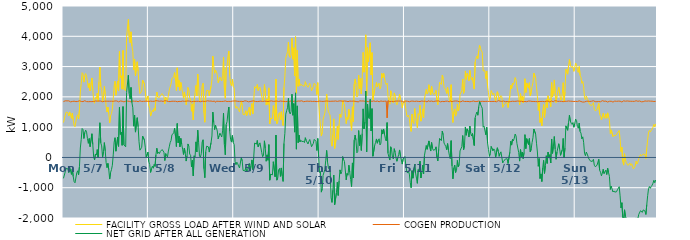
| Category | FACILITY GROSS LOAD AFTER WIND AND SOLAR | COGEN PRODUCTION | NET GRID AFTER ALL GENERATION |
|---|---|---|---|
|  Mon  5/7 | 1152 | 1843 | -691 |
|  Mon  5/7 | 1163 | 1846 | -683 |
|  Mon  5/7 | 1392 | 1869 | -477 |
|  Mon  5/7 | 1498 | 1859 | -361 |
|  Mon  5/7 | 1514 | 1867 | -353 |
|  Mon  5/7 | 1474 | 1850 | -376 |
|  Mon  5/7 | 1367 | 1868 | -501 |
|  Mon  5/7 | 1501 | 1839 | -338 |
|  Mon  5/7 | 1387 | 1835 | -448 |
|  Mon  5/7 | 1292 | 1853 | -561 |
|  Mon  5/7 | 1465 | 1848 | -383 |
|  Mon  5/7 | 1230 | 1861 | -631 |
|  Mon  5/7 | 1054 | 1856 | -802 |
|  Mon  5/7 | 1012 | 1849 | -837 |
|  Mon  5/7 | 999 | 1843 | -844 |
|  Mon  5/7 | 1354 | 1860 | -506 |
|  Mon  5/7 | 1407 | 1848 | -441 |
|  Mon  5/7 | 1271 | 1845 | -574 |
|  Mon  5/7 | 1564 | 1871 | -307 |
|  Mon  5/7 | 2160 | 1848 | 312 |
|  Mon  5/7 | 2443 | 1849 | 594 |
|  Mon  5/7 | 2799 | 1843 | 956 |
|  Mon  5/7 | 2764 | 1843 | 921 |
|  Mon  5/7 | 2487 | 1861 | 626 |
|  Mon  5/7 | 2698 | 1873 | 825 |
|  Mon  5/7 | 2769 | 1867 | 902 |
|  Mon  5/7 | 2679 | 1844 | 835 |
|  Mon  5/7 | 2483 | 1862 | 621 |
|  Mon  5/7 | 2306 | 1840 | 466 |
|  Mon  5/7 | 2446 | 1821 | 625 |
|  Mon  5/7 | 2199 | 1844 | 355 |
|  Mon  5/7 | 2175 | 1852 | 323 |
|  Mon  5/7 | 2624 | 1843 | 781 |
|  Mon  5/7 | 2242 | 1816 | 426 |
|  Mon  5/7 | 1863 | 1847 | 16 |
|  Mon  5/7 | 1789 | 1870 | -81 |
|  Mon  5/7 | 1977 | 1863 | 114 |
|  Mon  5/7 | 1939 | 1860 | 79 |
|  Mon  5/7 | 2119 | 1859 | 260 |
|  Mon  5/7 | 1848 | 1858 | -10 |
|  Mon  5/7 | 2497 | 1863 | 634 |
|  Mon  5/7 | 2985 | 1839 | 1146 |
|  Mon  5/7 | 2340 | 1861 | 479 |
|  Mon  5/7 | 2253 | 1872 | 381 |
|  Mon  5/7 | 1845 | 1839 | 6 |
|  Mon  5/7 | 2042 | 1849 | 193 |
|  Mon  5/7 | 2344 | 1855 | 489 |
|  Mon  5/7 | 2083 | 1866 | 217 |
|  Mon  5/7 | 1684 | 1857 | -173 |
|  Mon  5/7 | 1499 | 1837 | -338 |
|  Mon  5/7 | 1659 | 1856 | -197 |
|  Mon  5/7 | 1444 | 1849 | -405 |
|  Mon  5/7 | 1141 | 1855 | -714 |
|  Mon  5/7 | 1372 | 1870 | -498 |
|  Mon  5/7 | 1452 | 1856 | -404 |
|  Mon  5/7 | 1593 | 1850 | -257 |
|  Mon  5/7 | 1936 | 1851 | 85 |
|  Mon  5/7 | 2355 | 1853 | 502 |
|  Mon  5/7 | 2516 | 1865 | 651 |
|  Mon  5/7 | 2054 | 1848 | 206 |
|  Mon  5/7 | 2043 | 1864 | 179 |
|  Mon  5/7 | 2524 | 1858 | 666 |
|  Mon  5/7 | 2199 | 1835 | 364 |
|  Mon  5/7 | 3498 | 1845 | 1653 |
|  Mon  5/7 | 2624 | 1863 | 761 |
|  Mon  5/7 | 2697 | 1864 | 833 |
|  Mon  5/7 | 2255 | 1855 | 400 |
|  Mon  5/7 | 3532 | 1853 | 1679 |
|  Mon  5/7 | 2248 | 1835 | 413 |
|  Mon  5/7 | 2235 | 1841 | 394 |
|  Mon  5/7 | 2206 | 1856 | 350 |
|  Mon  5/7 | 3995 | 1849 | 2146 |
|  Mon  5/7 | 3989 | 1860 | 2129 |
|  Mon  5/7 | 4556 | 1844 | 2712 |
|  Mon  5/7 | 3958 | 1852 | 2106 |
|  Mon  5/7 | 3786 | 1855 | 1931 |
|  Mon  5/7 | 4147 | 1836 | 2311 |
|  Mon  5/7 | 3677 | 1868 | 1809 |
|  Mon  5/7 | 3503 | 1863 | 1640 |
|  Mon  5/7 | 2892 | 1860 | 1032 |
|  Mon  5/7 | 3250 | 1854 | 1396 |
|  Mon  5/7 | 2698 | 1862 | 836 |
|  Mon  5/7 | 2688 | 1857 | 831 |
|  Mon  5/7 | 3158 | 1847 | 1311 |
|  Mon  5/7 | 2853 | 1840 | 1013 |
|  Mon  5/7 | 2384 | 1863 | 521 |
|  Mon  5/7 | 2107 | 1868 | 239 |
|  Mon  5/7 | 2128 | 1868 | 260 |
|  Mon  5/7 | 2183 | 1849 | 334 |
|  Mon  5/7 | 2557 | 1851 | 706 |
|  Mon  5/7 | 2577 | 1853 | 724 |
|  Mon  5/7 | 2428 | 1850 | 578 |
|  Mon  5/7 | 2194 | 1855 | 339 |
|  Mon  5/7 | 1855 | 1850 | 5 |
|  Mon  5/7 | 1851 | 1858 | -7 |
|  Mon  5/7 | 2030 | 1859 | 171 |
|  Tue  5/8 | 1710 | 1850 | -140 |
|  Tue  5/8 | 1614 | 1850 | -236 |
|  Tue  5/8 | 1365 | 1860 | -495 |
|  Tue  5/8 | 1467 | 1839 | -372 |
|  Tue  5/8 | 1561 | 1851 | -290 |
|  Tue  5/8 | 1504 | 1863 | -359 |
|  Tue  5/8 | 1627 | 1853 | -226 |
|  Tue  5/8 | 1549 | 1848 | -299 |
|  Tue  5/8 | 1963 | 1874 | 89 |
|  Tue  5/8 | 2160 | 1856 | 304 |
|  Tue  5/8 | 1995 | 1866 | 129 |
|  Tue  5/8 | 2012 | 1834 | 178 |
|  Tue  5/8 | 1984 | 1855 | 129 |
|  Tue  5/8 | 2050 | 1850 | 200 |
|  Tue  5/8 | 2083 | 1863 | 220 |
|  Tue  5/8 | 2108 | 1848 | 260 |
|  Tue  5/8 | 2087 | 1849 | 238 |
|  Tue  5/8 | 2009 | 1837 | 172 |
|  Tue  5/8 | 1769 | 1872 | -103 |
|  Tue  5/8 | 1990 | 1862 | 128 |
|  Tue  5/8 | 2013 | 1865 | 148 |
|  Tue  5/8 | 1875 | 1860 | 15 |
|  Tue  5/8 | 2056 | 1846 | 210 |
|  Tue  5/8 | 2212 | 1862 | 350 |
|  Tue  5/8 | 2330 | 1843 | 487 |
|  Tue  5/8 | 2420 | 1865 | 555 |
|  Tue  5/8 | 2598 | 1855 | 743 |
|  Tue  5/8 | 2608 | 1857 | 751 |
|  Tue  5/8 | 2667 | 1854 | 813 |
|  Tue  5/8 | 2801 | 1835 | 966 |
|  Tue  5/8 | 2561 | 1854 | 707 |
|  Tue  5/8 | 2207 | 1849 | 358 |
|  Tue  5/8 | 2959 | 1838 | 1121 |
|  Tue  5/8 | 2324 | 1841 | 483 |
|  Tue  5/8 | 2549 | 1850 | 699 |
|  Tue  5/8 | 2212 | 1863 | 349 |
|  Tue  5/8 | 2475 | 1846 | 629 |
|  Tue  5/8 | 2312 | 1875 | 437 |
|  Tue  5/8 | 2135 | 1861 | 274 |
|  Tue  5/8 | 1956 | 1858 | 98 |
|  Tue  5/8 | 2162 | 1852 | 310 |
|  Tue  5/8 | 1988 | 1860 | 128 |
|  Tue  5/8 | 1737 | 1857 | -120 |
|  Tue  5/8 | 1916 | 1861 | 55 |
|  Tue  5/8 | 2310 | 1865 | 445 |
|  Tue  5/8 | 2217 | 1846 | 371 |
|  Tue  5/8 | 1968 | 1858 | 110 |
|  Tue  5/8 | 1926 | 1854 | 72 |
|  Tue  5/8 | 1526 | 1838 | -312 |
|  Tue  5/8 | 1766 | 1859 | -93 |
|  Tue  5/8 | 1237 | 1848 | -611 |
|  Tue  5/8 | 1893 | 1838 | 55 |
|  Tue  5/8 | 1865 | 1850 | 15 |
|  Tue  5/8 | 2374 | 1860 | 514 |
|  Tue  5/8 | 2032 | 1853 | 179 |
|  Tue  5/8 | 2754 | 1854 | 900 |
|  Tue  5/8 | 2356 | 1853 | 503 |
|  Tue  5/8 | 1891 | 1841 | 50 |
|  Tue  5/8 | 1845 | 1838 | 7 |
|  Tue  5/8 | 1972 | 1851 | 121 |
|  Tue  5/8 | 2367 | 1858 | 509 |
|  Tue  5/8 | 2448 | 1865 | 583 |
|  Tue  5/8 | 1476 | 1849 | -373 |
|  Tue  5/8 | 1162 | 1832 | -670 |
|  Tue  5/8 | 2036 | 1852 | 184 |
|  Tue  5/8 | 2213 | 1842 | 371 |
|  Tue  5/8 | 2229 | 1869 | 360 |
|  Tue  5/8 | 2205 | 1857 | 348 |
|  Tue  5/8 | 2037 | 1860 | 177 |
|  Tue  5/8 | 2055 | 1855 | 200 |
|  Tue  5/8 | 2350 | 1861 | 489 |
|  Tue  5/8 | 2571 | 1862 | 709 |
|  Tue  5/8 | 3346 | 1849 | 1497 |
|  Tue  5/8 | 3019 | 1866 | 1153 |
|  Tue  5/8 | 2781 | 1862 | 919 |
|  Tue  5/8 | 2884 | 1818 | 1066 |
|  Tue  5/8 | 2839 | 1857 | 982 |
|  Tue  5/8 | 2722 | 1849 | 873 |
|  Tue  5/8 | 2468 | 1852 | 616 |
|  Tue  5/8 | 2547 | 1835 | 712 |
|  Tue  5/8 | 2651 | 1850 | 801 |
|  Tue  5/8 | 2567 | 1827 | 740 |
|  Tue  5/8 | 2525 | 1848 | 677 |
|  Tue  5/8 | 2709 | 1833 | 876 |
|  Tue  5/8 | 3314 | 1851 | 1463 |
|  Tue  5/8 | 2268 | 1846 | 422 |
|  Tue  5/8 | 1953 | 1866 | 87 |
|  Tue  5/8 | 2953 | 1867 | 1086 |
|  Tue  5/8 | 3029 | 1845 | 1184 |
|  Tue  5/8 | 3322 | 1849 | 1473 |
|  Tue  5/8 | 3515 | 1850 | 1665 |
|  Tue  5/8 | 2701 | 1841 | 860 |
|  Tue  5/8 | 2433 | 1846 | 587 |
|  Tue  5/8 | 2366 | 1859 | 507 |
|  Tue  5/8 | 2585 | 1860 | 725 |
|  Tue  5/8 | 2343 | 1849 | 494 |
|  Wed  5/9 | 2287 | 1863 | 424 |
|  Wed  5/9 | 1722 | 1858 | -136 |
|  Wed  5/9 | 1621 | 1863 | -242 |
|  Wed  5/9 | 1682 | 1839 | -157 |
|  Wed  5/9 | 1644 | 1852 | -208 |
|  Wed  5/9 | 1573 | 1864 | -291 |
|  Wed  5/9 | 1503 | 1850 | -347 |
|  Wed  5/9 | 1497 | 1859 | -362 |
|  Wed  5/9 | 1849 | 1852 | -3 |
|  Wed  5/9 | 1725 | 1837 | -112 |
|  Wed  5/9 | 1415 | 1843 | -428 |
|  Wed  5/9 | 1433 | 1853 | -420 |
|  Wed  5/9 | 1423 | 1869 | -446 |
|  Wed  5/9 | 1540 | 1872 | -332 |
|  Wed  5/9 | 1381 | 1860 | -479 |
|  Wed  5/9 | 1409 | 1852 | -443 |
|  Wed  5/9 | 1558 | 1837 | -279 |
|  Wed  5/9 | 1658 | 1859 | -201 |
|  Wed  5/9 | 1394 | 1846 | -452 |
|  Wed  5/9 | 1611 | 1871 | -260 |
|  Wed  5/9 | 1779 | 1861 | -82 |
|  Wed  5/9 | 1439 | 1841 | -402 |
|  Wed  5/9 | 1891 | 1865 | 26 |
|  Wed  5/9 | 2338 | 1862 | 476 |
|  Wed  5/9 | 2347 | 1848 | 499 |
|  Wed  5/9 | 2288 | 1850 | 438 |
|  Wed  5/9 | 2405 | 1844 | 561 |
|  Wed  5/9 | 2207 | 1856 | 351 |
|  Wed  5/9 | 2275 | 1851 | 424 |
|  Wed  5/9 | 2318 | 1836 | 482 |
|  Wed  5/9 | 2331 | 1860 | 471 |
|  Wed  5/9 | 2025 | 1862 | 163 |
|  Wed  5/9 | 1868 | 1846 | 22 |
|  Wed  5/9 | 1942 | 1862 | 80 |
|  Wed  5/9 | 2406 | 1858 | 548 |
|  Wed  5/9 | 2150 | 1856 | 294 |
|  Wed  5/9 | 1728 | 1854 | -126 |
|  Wed  5/9 | 1928 | 1844 | 84 |
|  Wed  5/9 | 1752 | 1846 | -94 |
|  Wed  5/9 | 2296 | 1873 | 423 |
|  Wed  5/9 | 1107 | 1859 | -752 |
|  Wed  5/9 | 1300 | 1853 | -553 |
|  Wed  5/9 | 1314 | 1866 | -552 |
|  Wed  5/9 | 1283 | 1861 | -578 |
|  Wed  5/9 | 1709 | 1851 | -142 |
|  Wed  5/9 | 1689 | 1855 | -166 |
|  Wed  5/9 | 1217 | 1855 | -638 |
|  Wed  5/9 | 2585 | 1847 | 738 |
|  Wed  5/9 | 1113 | 1863 | -750 |
|  Wed  5/9 | 1172 | 1853 | -681 |
|  Wed  5/9 | 1437 | 1847 | -410 |
|  Wed  5/9 | 1481 | 1844 | -363 |
|  Wed  5/9 | 1235 | 1862 | -627 |
|  Wed  5/9 | 1508 | 1855 | -347 |
|  Wed  5/9 | 1240 | 1854 | -614 |
|  Wed  5/9 | 1053 | 1845 | -792 |
|  Wed  5/9 | 2312 | 1849 | 463 |
|  Wed  5/9 | 2664 | 1867 | 797 |
|  Wed  5/9 | 3272 | 1843 | 1429 |
|  Wed  5/9 | 3389 | 1847 | 1542 |
|  Wed  5/9 | 3490 | 1851 | 1639 |
|  Wed  5/9 | 3807 | 1858 | 1949 |
|  Wed  5/9 | 3353 | 1848 | 1505 |
|  Wed  5/9 | 3296 | 1860 | 1436 |
|  Wed  5/9 | 3380 | 1865 | 1515 |
|  Wed  5/9 | 3937 | 1850 | 2087 |
|  Wed  5/9 | 3243 | 1850 | 1393 |
|  Wed  5/9 | 3620 | 1842 | 1778 |
|  Wed  5/9 | 2694 | 1859 | 835 |
|  Wed  5/9 | 3989 | 1858 | 2131 |
|  Wed  5/9 | 2121 | 1848 | 273 |
|  Wed  5/9 | 3536 | 1834 | 1702 |
|  Wed  5/9 | 2349 | 1862 | 487 |
|  Wed  5/9 | 2587 | 1852 | 735 |
|  Wed  5/9 | 2369 | 1859 | 510 |
|  Wed  5/9 | 2412 | 1844 | 568 |
|  Wed  5/9 | 2394 | 1869 | 525 |
|  Wed  5/9 | 2372 | 1862 | 510 |
|  Wed  5/9 | 2372 | 1840 | 532 |
|  Wed  5/9 | 2348 | 1858 | 490 |
|  Wed  5/9 | 2500 | 1849 | 651 |
|  Wed  5/9 | 2405 | 1849 | 556 |
|  Wed  5/9 | 2438 | 1859 | 579 |
|  Wed  5/9 | 2317 | 1873 | 444 |
|  Wed  5/9 | 2386 | 1852 | 534 |
|  Wed  5/9 | 2448 | 1857 | 591 |
|  Wed  5/9 | 2339 | 1857 | 482 |
|  Wed  5/9 | 2200 | 1847 | 353 |
|  Wed  5/9 | 2227 | 1848 | 379 |
|  Wed  5/9 | 2333 | 1871 | 462 |
|  Wed  5/9 | 2450 | 1853 | 597 |
|  Wed  5/9 | 2474 | 1875 | 599 |
|  Wed  5/9 | 2375 | 1844 | 531 |
|  Wed  5/9 | 2077 | 1847 | 230 |
|  Wed  5/9 | 2469 | 1845 | 624 |
|  Wed  5/9 | 1855 | 1844 | 11 |
|  Thu  5/10 | 1364 | 1861 | -497 |
|  Thu  5/10 | 1392 | 1852 | -460 |
|  Thu  5/10 | 706 | 1852 | -1146 |
|  Thu  5/10 | 827 | 1860 | -1033 |
|  Thu  5/10 | 1258 | 1849 | -591 |
|  Thu  5/10 | 1289 | 1862 | -573 |
|  Thu  5/10 | 1465 | 1857 | -392 |
|  Thu  5/10 | 1766 | 1858 | -92 |
|  Thu  5/10 | 2094 | 1863 | 231 |
|  Thu  5/10 | 1705 | 1859 | -154 |
|  Thu  5/10 | 1510 | 1857 | -347 |
|  Thu  5/10 | 1454 | 1845 | -391 |
|  Thu  5/10 | 1376 | 1852 | -476 |
|  Thu  5/10 | 530 | 1862 | -1332 |
|  Thu  5/10 | 372 | 1857 | -1485 |
|  Thu  5/10 | 759 | 1840 | -1081 |
|  Thu  5/10 | 1273 | 1856 | -583 |
|  Thu  5/10 | 295 | 1855 | -1560 |
|  Thu  5/10 | 289 | 1864 | -1575 |
|  Thu  5/10 | 685 | 1855 | -1170 |
|  Thu  5/10 | 1030 | 1850 | -820 |
|  Thu  5/10 | 596 | 1851 | -1255 |
|  Thu  5/10 | 1086 | 1864 | -778 |
|  Thu  5/10 | 1434 | 1845 | -411 |
|  Thu  5/10 | 1323 | 1865 | -542 |
|  Thu  5/10 | 1391 | 1856 | -465 |
|  Thu  5/10 | 1882 | 1853 | 29 |
|  Thu  5/10 | 1788 | 1856 | -68 |
|  Thu  5/10 | 1730 | 1863 | -133 |
|  Thu  5/10 | 1697 | 1850 | -153 |
|  Thu  5/10 | 1117 | 1857 | -740 |
|  Thu  5/10 | 1321 | 1846 | -525 |
|  Thu  5/10 | 1254 | 1841 | -587 |
|  Thu  5/10 | 1588 | 1845 | -257 |
|  Thu  5/10 | 1368 | 1860 | -492 |
|  Thu  5/10 | 1139 | 1866 | -727 |
|  Thu  5/10 | 892 | 1856 | -964 |
|  Thu  5/10 | 1671 | 1852 | -181 |
|  Thu  5/10 | 1183 | 1860 | -677 |
|  Thu  5/10 | 2420 | 1848 | 572 |
|  Thu  5/10 | 2591 | 1853 | 738 |
|  Thu  5/10 | 2413 | 1851 | 562 |
|  Thu  5/10 | 1994 | 1842 | 152 |
|  Thu  5/10 | 2043 | 1844 | 199 |
|  Thu  5/10 | 2721 | 1834 | 887 |
|  Thu  5/10 | 2261 | 1869 | 392 |
|  Thu  5/10 | 2605 | 1862 | 743 |
|  Thu  5/10 | 2093 | 1862 | 231 |
|  Thu  5/10 | 2634 | 1843 | 791 |
|  Thu  5/10 | 3468 | 1864 | 1604 |
|  Thu  5/10 | 2814 | 1874 | 940 |
|  Thu  5/10 | 3024 | 1852 | 1172 |
|  Thu  5/10 | 4049 | 1859 | 2190 |
|  Thu  5/10 | 2034 | 1850 | 184 |
|  Thu  5/10 | 3627 | 1867 | 1760 |
|  Thu  5/10 | 3154 | 1843 | 1311 |
|  Thu  5/10 | 3134 | 1857 | 1277 |
|  Thu  5/10 | 3786 | 1868 | 1918 |
|  Thu  5/10 | 2720 | 1846 | 874 |
|  Thu  5/10 | 3462 | 1851 | 1611 |
|  Thu  5/10 | 1897 | 1858 | 39 |
|  Thu  5/10 | 1928 | 1866 | 62 |
|  Thu  5/10 | 2257 | 1860 | 397 |
|  Thu  5/10 | 2341 | 1847 | 494 |
|  Thu  5/10 | 2472 | 1861 | 611 |
|  Thu  5/10 | 2331 | 1862 | 469 |
|  Thu  5/10 | 2397 | 1831 | 566 |
|  Thu  5/10 | 2453 | 1837 | 616 |
|  Thu  5/10 | 2262 | 1850 | 412 |
|  Thu  5/10 | 2334 | 1864 | 470 |
|  Thu  5/10 | 2775 | 1861 | 914 |
|  Thu  5/10 | 2623 | 1851 | 772 |
|  Thu  5/10 | 2786 | 1847 | 939 |
|  Thu  5/10 | 2630 | 1855 | 775 |
|  Thu  5/10 | 2474 | 1849 | 625 |
|  Thu  5/10 | 2407 | 1860 | 547 |
|  Thu  5/10 | 2457 | 1307 | 1150 |
|  Thu  5/10 | 2008 | 1872 | 136 |
|  Thu  5/10 | 1873 | 1858 | 15 |
|  Thu  5/10 | 1759 | 1845 | -86 |
|  Thu  5/10 | 2201 | 1850 | 351 |
|  Thu  5/10 | 2115 | 1851 | 264 |
|  Thu  5/10 | 1855 | 1850 | 5 |
|  Thu  5/10 | 1797 | 1847 | -50 |
|  Thu  5/10 | 2130 | 1841 | 289 |
|  Thu  5/10 | 2026 | 1856 | 170 |
|  Thu  5/10 | 1819 | 1834 | -15 |
|  Thu  5/10 | 1736 | 1862 | -126 |
|  Thu  5/10 | 1835 | 1848 | -13 |
|  Thu  5/10 | 1956 | 1861 | 95 |
|  Thu  5/10 | 2084 | 1837 | 247 |
|  Thu  5/10 | 1908 | 1861 | 47 |
|  Thu  5/10 | 1874 | 1853 | 21 |
|  Thu  5/10 | 1636 | 1856 | -220 |
|  Thu  5/10 | 1797 | 1854 | -57 |
|  Thu  5/10 | 1769 | 1825 | -56 |
|  Fri  5/11 | 1885 | 1855 | 30 |
|  Fri  5/11 | 1611 | 1863 | -252 |
|  Fri  5/11 | 1402 | 1852 | -450 |
|  Fri  5/11 | 1337 | 1853 | -516 |
|  Fri  5/11 | 1400 | 1855 | -455 |
|  Fri  5/11 | 1288 | 1838 | -550 |
|  Fri  5/11 | 1013 | 1837 | -824 |
|  Fri  5/11 | 859 | 1859 | -1000 |
|  Fri  5/11 | 1426 | 1863 | -437 |
|  Fri  5/11 | 1173 | 1859 | -686 |
|  Fri  5/11 | 1121 | 1840 | -719 |
|  Fri  5/11 | 1616 | 1849 | -233 |
|  Fri  5/11 | 1335 | 1851 | -516 |
|  Fri  5/11 | 1174 | 1858 | -684 |
|  Fri  5/11 | 983 | 1838 | -855 |
|  Fri  5/11 | 1445 | 1849 | -404 |
|  Fri  5/11 | 1388 | 1862 | -474 |
|  Fri  5/11 | 1719 | 1845 | -126 |
|  Fri  5/11 | 1197 | 1875 | -678 |
|  Fri  5/11 | 1364 | 1863 | -499 |
|  Fri  5/11 | 1601 | 1851 | -250 |
|  Fri  5/11 | 1307 | 1853 | -546 |
|  Fri  5/11 | 1920 | 1856 | 64 |
|  Fri  5/11 | 2097 | 1856 | 241 |
|  Fri  5/11 | 2245 | 1853 | 392 |
|  Fri  5/11 | 2100 | 1832 | 268 |
|  Fri  5/11 | 2150 | 1871 | 279 |
|  Fri  5/11 | 2401 | 1856 | 545 |
|  Fri  5/11 | 2375 | 1851 | 524 |
|  Fri  5/11 | 2066 | 1855 | 211 |
|  Fri  5/11 | 2353 | 1860 | 493 |
|  Fri  5/11 | 2159 | 1855 | 304 |
|  Fri  5/11 | 2081 | 1844 | 237 |
|  Fri  5/11 | 2053 | 1846 | 207 |
|  Fri  5/11 | 2119 | 1858 | 261 |
|  Fri  5/11 | 2212 | 1862 | 350 |
|  Fri  5/11 | 1872 | 1863 | 9 |
|  Fri  5/11 | 1740 | 1856 | -116 |
|  Fri  5/11 | 2136 | 1866 | 270 |
|  Fri  5/11 | 2483 | 1854 | 629 |
|  Fri  5/11 | 2459 | 1835 | 624 |
|  Fri  5/11 | 2406 | 1853 | 553 |
|  Fri  5/11 | 2718 | 1850 | 868 |
|  Fri  5/11 | 2607 | 1856 | 751 |
|  Fri  5/11 | 2317 | 1842 | 475 |
|  Fri  5/11 | 2280 | 1862 | 418 |
|  Fri  5/11 | 2217 | 1857 | 360 |
|  Fri  5/11 | 2111 | 1855 | 256 |
|  Fri  5/11 | 2314 | 1857 | 457 |
|  Fri  5/11 | 2091 | 1853 | 238 |
|  Fri  5/11 | 1904 | 1833 | 71 |
|  Fri  5/11 | 1830 | 1867 | -37 |
|  Fri  5/11 | 2401 | 1847 | 554 |
|  Fri  5/11 | 1556 | 1839 | -283 |
|  Fri  5/11 | 1154 | 1861 | -707 |
|  Fri  5/11 | 1512 | 1859 | -347 |
|  Fri  5/11 | 1602 | 1854 | -252 |
|  Fri  5/11 | 1362 | 1863 | -501 |
|  Fri  5/11 | 1417 | 1855 | -438 |
|  Fri  5/11 | 1761 | 1860 | -99 |
|  Fri  5/11 | 1534 | 1845 | -311 |
|  Fri  5/11 | 1603 | 1840 | -237 |
|  Fri  5/11 | 2082 | 1867 | 215 |
|  Fri  5/11 | 2079 | 1837 | 242 |
|  Fri  5/11 | 2204 | 1848 | 356 |
|  Fri  5/11 | 2590 | 1868 | 722 |
|  Fri  5/11 | 2119 | 1863 | 256 |
|  Fri  5/11 | 2229 | 1847 | 382 |
|  Fri  5/11 | 2856 | 1850 | 1006 |
|  Fri  5/11 | 2580 | 1848 | 732 |
|  Fri  5/11 | 2778 | 1835 | 943 |
|  Fri  5/11 | 2718 | 1849 | 869 |
|  Fri  5/11 | 2528 | 1854 | 674 |
|  Fri  5/11 | 2873 | 1838 | 1035 |
|  Fri  5/11 | 2656 | 1858 | 798 |
|  Fri  5/11 | 2554 | 1848 | 706 |
|  Fri  5/11 | 2649 | 1858 | 791 |
|  Fri  5/11 | 2677 | 1863 | 814 |
|  Fri  5/11 | 2257 | 1863 | 394 |
|  Fri  5/11 | 3154 | 1846 | 1308 |
|  Fri  5/11 | 3271 | 1848 | 1423 |
|  Fri  5/11 | 3346 | 1846 | 1500 |
|  Fri  5/11 | 3261 | 1867 | 1394 |
|  Fri  5/11 | 3526 | 1861 | 1665 |
|  Fri  5/11 | 3702 | 1862 | 1840 |
|  Fri  5/11 | 3604 | 1848 | 1756 |
|  Fri  5/11 | 3520 | 1831 | 1689 |
|  Fri  5/11 | 3475 | 1853 | 1622 |
|  Fri  5/11 | 2857 | 1859 | 998 |
|  Fri  5/11 | 2880 | 1848 | 1032 |
|  Fri  5/11 | 2864 | 1855 | 1009 |
|  Fri  5/11 | 2599 | 1850 | 749 |
|  Fri  5/11 | 2850 | 1855 | 995 |
|  Fri  5/11 | 2329 | 1852 | 477 |
|  Fri  5/11 | 2135 | 1869 | 266 |
|  Fri  5/11 | 1884 | 1849 | 35 |
|  Sat  5/12 | 1992 | 1864 | 128 |
|  Sat  5/12 | 2211 | 1848 | 363 |
|  Sat  5/12 | 2190 | 1837 | 353 |
|  Sat  5/12 | 2069 | 1849 | 220 |
|  Sat  5/12 | 2117 | 1835 | 282 |
|  Sat  5/12 | 2084 | 1850 | 234 |
|  Sat  5/12 | 1855 | 1852 | 3 |
|  Sat  5/12 | 1822 | 1837 | -15 |
|  Sat  5/12 | 2169 | 1850 | 319 |
|  Sat  5/12 | 2084 | 1876 | 208 |
|  Sat  5/12 | 1886 | 1849 | 37 |
|  Sat  5/12 | 1991 | 1858 | 133 |
|  Sat  5/12 | 2042 | 1857 | 185 |
|  Sat  5/12 | 2002 | 1849 | 153 |
|  Sat  5/12 | 1655 | 1837 | -182 |
|  Sat  5/12 | 1733 | 1862 | -129 |
|  Sat  5/12 | 1722 | 1855 | -133 |
|  Sat  5/12 | 1789 | 1841 | -52 |
|  Sat  5/12 | 1794 | 1844 | -50 |
|  Sat  5/12 | 1805 | 1848 | -43 |
|  Sat  5/12 | 1647 | 1847 | -200 |
|  Sat  5/12 | 1663 | 1835 | -172 |
|  Sat  5/12 | 2037 | 1864 | 173 |
|  Sat  5/12 | 2383 | 1846 | 537 |
|  Sat  5/12 | 2269 | 1862 | 407 |
|  Sat  5/12 | 2454 | 1855 | 599 |
|  Sat  5/12 | 2406 | 1857 | 549 |
|  Sat  5/12 | 2488 | 1850 | 638 |
|  Sat  5/12 | 2638 | 1866 | 772 |
|  Sat  5/12 | 2560 | 1854 | 706 |
|  Sat  5/12 | 2325 | 1866 | 459 |
|  Sat  5/12 | 2293 | 1863 | 430 |
|  Sat  5/12 | 2019 | 1859 | 160 |
|  Sat  5/12 | 1732 | 1854 | -122 |
|  Sat  5/12 | 2107 | 1848 | 259 |
|  Sat  5/12 | 1876 | 1854 | 22 |
|  Sat  5/12 | 2016 | 1839 | 177 |
|  Sat  5/12 | 1804 | 1842 | -38 |
|  Sat  5/12 | 2009 | 1845 | 164 |
|  Sat  5/12 | 2599 | 1847 | 752 |
|  Sat  5/12 | 2144 | 1854 | 290 |
|  Sat  5/12 | 2460 | 1839 | 621 |
|  Sat  5/12 | 2466 | 1863 | 603 |
|  Sat  5/12 | 2289 | 1861 | 428 |
|  Sat  5/12 | 2466 | 1842 | 624 |
|  Sat  5/12 | 2038 | 1859 | 179 |
|  Sat  5/12 | 2130 | 1855 | 275 |
|  Sat  5/12 | 2337 | 1848 | 489 |
|  Sat  5/12 | 2481 | 1830 | 651 |
|  Sat  5/12 | 2786 | 1847 | 939 |
|  Sat  5/12 | 2760 | 1852 | 908 |
|  Sat  5/12 | 2614 | 1844 | 770 |
|  Sat  5/12 | 2332 | 1863 | 469 |
|  Sat  5/12 | 2019 | 1840 | 179 |
|  Sat  5/12 | 1553 | 1846 | -293 |
|  Sat  5/12 | 1810 | 1847 | -37 |
|  Sat  5/12 | 1156 | 1853 | -697 |
|  Sat  5/12 | 1302 | 1847 | -545 |
|  Sat  5/12 | 1045 | 1840 | -795 |
|  Sat  5/12 | 1503 | 1850 | -347 |
|  Sat  5/12 | 1745 | 1842 | -97 |
|  Sat  5/12 | 1313 | 1841 | -528 |
|  Sat  5/12 | 1582 | 1852 | -270 |
|  Sat  5/12 | 1912 | 1855 | 57 |
|  Sat  5/12 | 1646 | 1844 | -198 |
|  Sat  5/12 | 2036 | 1861 | 175 |
|  Sat  5/12 | 1846 | 1858 | -12 |
|  Sat  5/12 | 1923 | 1831 | 92 |
|  Sat  5/12 | 1680 | 1863 | -183 |
|  Sat  5/12 | 2472 | 1863 | 609 |
|  Sat  5/12 | 1996 | 1862 | 134 |
|  Sat  5/12 | 2203 | 1835 | 368 |
|  Sat  5/12 | 2559 | 1869 | 690 |
|  Sat  5/12 | 2106 | 1837 | 269 |
|  Sat  5/12 | 1809 | 1870 | -61 |
|  Sat  5/12 | 2026 | 1847 | 179 |
|  Sat  5/12 | 2007 | 1851 | 156 |
|  Sat  5/12 | 2315 | 1863 | 452 |
|  Sat  5/12 | 2133 | 1854 | 279 |
|  Sat  5/12 | 1924 | 1855 | 69 |
|  Sat  5/12 | 1889 | 1851 | 38 |
|  Sat  5/12 | 2117 | 1856 | 261 |
|  Sat  5/12 | 2468 | 1841 | 627 |
|  Sat  5/12 | 1843 | 1851 | -8 |
|  Sat  5/12 | 2162 | 1854 | 308 |
|  Sat  5/12 | 2913 | 1871 | 1042 |
|  Sat  5/12 | 2883 | 1853 | 1030 |
|  Sat  5/12 | 2750 | 1853 | 897 |
|  Sat  5/12 | 3014 | 1864 | 1150 |
|  Sat  5/12 | 3236 | 1844 | 1392 |
|  Sat  5/12 | 3058 | 1856 | 1202 |
|  Sat  5/12 | 2977 | 1848 | 1129 |
|  Sat  5/12 | 2944 | 1854 | 1090 |
|  Sat  5/12 | 2997 | 1846 | 1151 |
|  Sat  5/12 | 2842 | 1846 | 996 |
|  Sat  5/12 | 2969 | 1848 | 1121 |
|  Sun  5/13 | 3115 | 1851 | 1264 |
|  Sun  5/13 | 3071 | 1849 | 1222 |
|  Sun  5/13 | 2866 | 1844 | 1022 |
|  Sun  5/13 | 2807 | 1844 | 963 |
|  Sun  5/13 | 3003 | 1869 | 1134 |
|  Sun  5/13 | 2709 | 1851 | 858 |
|  Sun  5/13 | 2649 | 1846 | 803 |
|  Sun  5/13 | 2446 | 1837 | 609 |
|  Sun  5/13 | 2509 | 1828 | 681 |
|  Sun  5/13 | 2354 | 1854 | 500 |
|  Sun  5/13 | 1975 | 1832 | 143 |
|  Sun  5/13 | 1905 | 1849 | 56 |
|  Sun  5/13 | 2030 | 1852 | 178 |
|  Sun  5/13 | 1952 | 1840 | 112 |
|  Sun  5/13 | 1886 | 1858 | 28 |
|  Sun  5/13 | 1795 | 1848 | -53 |
|  Sun  5/13 | 1801 | 1848 | -47 |
|  Sun  5/13 | 1713 | 1842 | -129 |
|  Sun  5/13 | 1745 | 1856 | -111 |
|  Sun  5/13 | 1742 | 1867 | -125 |
|  Sun  5/13 | 1809 | 1871 | -62 |
|  Sun  5/13 | 1593 | 1851 | -258 |
|  Sun  5/13 | 1537 | 1842 | -305 |
|  Sun  5/13 | 1562 | 1854 | -292 |
|  Sun  5/13 | 1578 | 1841 | -263 |
|  Sun  5/13 | 1579 | 1853 | -274 |
|  Sun  5/13 | 1785 | 1846 | -61 |
|  Sun  5/13 | 1432 | 1856 | -424 |
|  Sun  5/13 | 1350 | 1838 | -488 |
|  Sun  5/13 | 1240 | 1848 | -608 |
|  Sun  5/13 | 1357 | 1874 | -517 |
|  Sun  5/13 | 1459 | 1850 | -391 |
|  Sun  5/13 | 1320 | 1854 | -534 |
|  Sun  5/13 | 1286 | 1851 | -565 |
|  Sun  5/13 | 1440 | 1859 | -419 |
|  Sun  5/13 | 1296 | 1860 | -564 |
|  Sun  5/13 | 1472 | 1829 | -357 |
|  Sun  5/13 | 1361 | 1861 | -500 |
|  Sun  5/13 | 1224 | 1853 | -629 |
|  Sun  5/13 | 789 | 1846 | -1057 |
|  Sun  5/13 | 909 | 1855 | -946 |
|  Sun  5/13 | 884 | 1859 | -975 |
|  Sun  5/13 | 686 | 1827 | -1141 |
|  Sun  5/13 | 729 | 1835 | -1106 |
|  Sun  5/13 | 716 | 1861 | -1145 |
|  Sun  5/13 | 724 | 1852 | -1128 |
|  Sun  5/13 | 719 | 1852 | -1133 |
|  Sun  5/13 | 803 | 1870 | -1067 |
|  Sun  5/13 | 782 | 1859 | -1077 |
|  Sun  5/13 | 891 | 1858 | -967 |
|  Sun  5/13 | 589 | 1857 | -1268 |
|  Sun  5/13 | 192 | 1858 | -1666 |
|  Sun  5/13 | 335 | 1830 | -1495 |
|  Sun  5/13 | -138 | 1843 | -1981 |
|  Sun  5/13 | -254 | 1868 | -2122 |
|  Sun  5/13 | 121 | 1851 | -1730 |
|  Sun  5/13 | -81 | 1856 | -1937 |
|  Sun  5/13 | -169 | 1867 | -2036 |
|  Sun  5/13 | -223 | 1864 | -2087 |
|  Sun  5/13 | -262 | 1859 | -2121 |
|  Sun  5/13 | -256 | 1857 | -2113 |
|  Sun  5/13 | -184 | 1873 | -2057 |
|  Sun  5/13 | -268 | 1854 | -2122 |
|  Sun  5/13 | -209 | 1845 | -2054 |
|  Sun  5/13 | -205 | 1852 | -2057 |
|  Sun  5/13 | -379 | 1841 | -2220 |
|  Sun  5/13 | -340 | 1851 | -2191 |
|  Sun  5/13 | -282 | 1840 | -2122 |
|  Sun  5/13 | -126 | 1871 | -1997 |
|  Sun  5/13 | -217 | 1857 | -2074 |
|  Sun  5/13 | -157 | 1854 | -2011 |
|  Sun  5/13 | -39 | 1840 | -1879 |
|  Sun  5/13 | -19 | 1863 | -1882 |
|  Sun  5/13 | 95 | 1854 | -1759 |
|  Sun  5/13 | 58 | 1837 | -1779 |
|  Sun  5/13 | 39 | 1854 | -1815 |
|  Sun  5/13 | 108 | 1841 | -1733 |
|  Sun  5/13 | 138 | 1856 | -1718 |
|  Sun  5/13 | 95 | 1865 | -1770 |
|  Sun  5/13 | -38 | 1845 | -1883 |
|  Sun  5/13 | 300 | 1857 | -1557 |
|  Sun  5/13 | 581 | 1842 | -1261 |
|  Sun  5/13 | 834 | 1864 | -1030 |
|  Sun  5/13 | 890 | 1852 | -962 |
|  Sun  5/13 | 838 | 1858 | -1020 |
|  Sun  5/13 | 900 | 1858 | -958 |
|  Sun  5/13 | 939 | 1857 | -918 |
|  Sun  5/13 | 997 | 1849 | -852 |
|  Sun  5/13 | 1091 | 1846 | -755 |
|  Sun  5/13 | 1007 | 1843 | -836 |
|  Sun  5/13 | 1103 | 1851 | -748 |
|  Sun  5/13 | 1090 | 1832 | -742 |